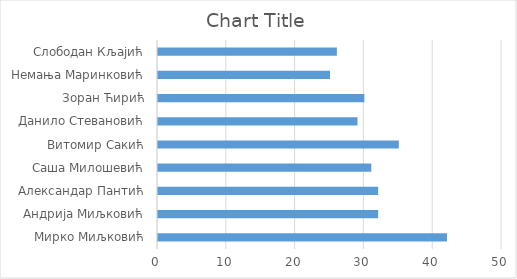
| Category | Series 0 |
|---|---|
| Мирко Миљковић | 42 |
| Андрија Миљковић | 32 |
| Александар Пантић | 32 |
| Саша Милошевић | 31 |
| Витомир Сакић | 35 |
| Данило Стевановић | 29 |
| Зоран Ћирић | 30 |
| Немања Маринковић | 25 |
| Слободан Кљајић | 26 |